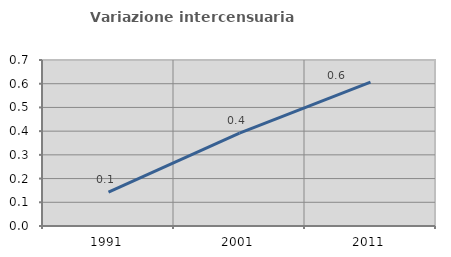
| Category | Variazione intercensuaria annua |
|---|---|
| 1991.0 | 0.142 |
| 2001.0 | 0.392 |
| 2011.0 | 0.607 |